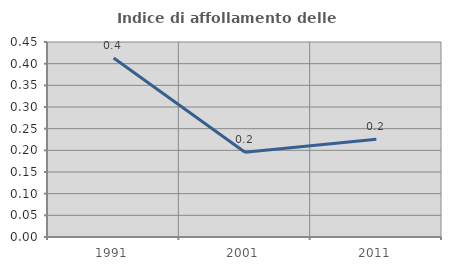
| Category | Indice di affollamento delle abitazioni  |
|---|---|
| 1991.0 | 0.413 |
| 2001.0 | 0.196 |
| 2011.0 | 0.226 |